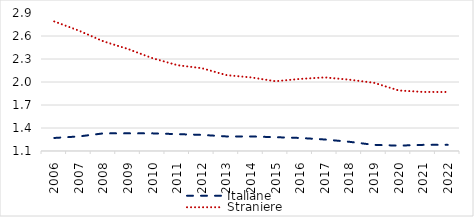
| Category | Italiane | Straniere |
|---|---|---|
| 2006.0 | 1.27 | 2.79 |
| 2007.0 | 1.29 | 2.67 |
| 2008.0 | 1.33 | 2.53 |
| 2009.0 | 1.33 | 2.43 |
| 2010.0 | 1.33 | 2.31 |
| 2011.0 | 1.32 | 2.22 |
| 2012.0 | 1.31 | 2.18 |
| 2013.0 | 1.29 | 2.09 |
| 2014.0 | 1.29 | 2.06 |
| 2015.0 | 1.28 | 2.01 |
| 2016.0 | 1.27 | 2.04 |
| 2017.0 | 1.25 | 2.06 |
| 2018.0 | 1.22 | 2.03 |
| 2019.0 | 1.18 | 1.99 |
| 2020.0 | 1.17 | 1.89 |
| 2021.0 | 1.18 | 1.87 |
| 2022.0 | 1.18 | 1.87 |